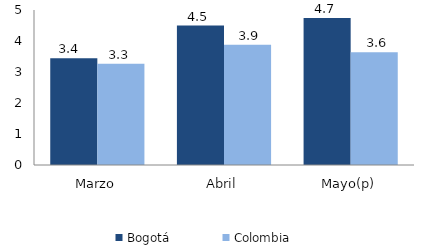
| Category | Bogotá | Colombia |
|---|---|---|
| Marzo | 3.444 | 3.265 |
| Abril | 4.5 | 3.876 |
| Mayo(p) | 4.739 | 3.639 |